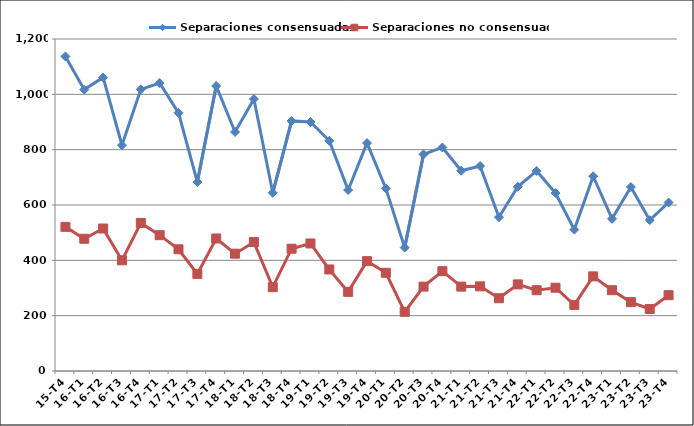
| Category | Separaciones consensuadas | Separaciones no consensuadas |
|---|---|---|
| 15-T4 | 1137 | 521 |
| 16-T1 | 1017 | 478 |
| 16-T2 | 1061 | 515 |
| 16-T3 | 816 | 400 |
| 16-T4 | 1018 | 535 |
| 17-T1 | 1041 | 491 |
| 17-T2 | 933 | 440 |
| 17-T3 | 683 | 351 |
| 17-T4 | 1030 | 479 |
| 18-T1 | 864 | 424 |
| 18-T2 | 983 | 466 |
| 18-T3 | 644 | 303 |
| 18-T4 | 904 | 442 |
| 19-T1 | 900 | 461 |
| 19-T2 | 832 | 367 |
| 19-T3 | 654 | 286 |
| 19-T4 | 824 | 397 |
| 20-T1 | 660 | 355 |
| 20-T2 | 446 | 214 |
| 20-T3 | 783 | 305 |
| 20-T4 | 808 | 361 |
| 21-T1 | 724 | 305 |
| 21-T2 | 741 | 306 |
| 21-T3 | 556 | 263 |
| 21-T4 | 666 | 313 |
| 22-T1 | 723 | 292 |
| 22-T2 | 643 | 301 |
| 22-T3 | 511 | 239 |
| 22-T4 | 704 | 342 |
| 23-T1 | 550 | 292 |
| 23-T2 | 665 | 249 |
| 23-T3 | 545 | 224 |
| 23-T4 | 609 | 274 |